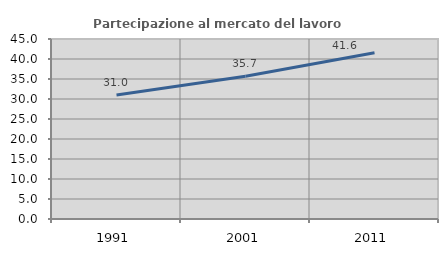
| Category | Partecipazione al mercato del lavoro  femminile |
|---|---|
| 1991.0 | 30.983 |
| 2001.0 | 35.697 |
| 2011.0 | 41.582 |